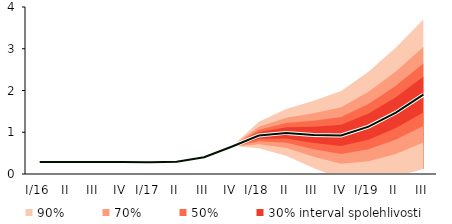
| Category | linka | Centerline |
|---|---|---|
| I/16 | 0.286 | 0.286 |
| II | 0.29 | 0.29 |
| III | 0.29 | 0.29 |
| IV | 0.289 | 0.289 |
| I/17 | 0.28 | 0.28 |
| II | 0.294 | 0.294 |
| III | 0.402 | 0.402 |
| IV | 0.654 | 0.654 |
| I/18 | 0.922 | 0.922 |
| II | 0.985 | 0.985 |
| III | 0.935 | 0.935 |
| IV | 0.924 | 0.924 |
| I/19 | 1.135 | 1.135 |
| II | 1.47 | 1.47 |
| III | 1.899 | 1.899 |